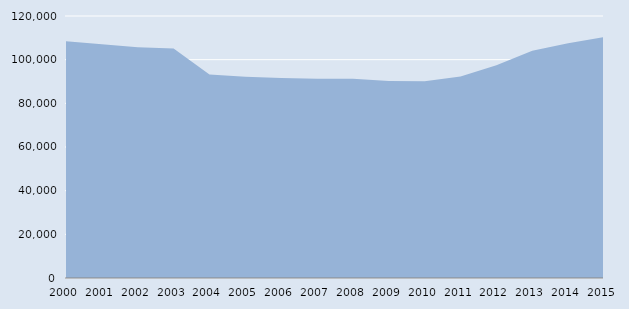
| Category | Series 0 |
|---|---|
| 2000.0 | 108397 |
| 2001.0 | 107057 |
| 2002.0 | 105667 |
| 2003.0 | 105135 |
| 2004.0 | 93190 |
| 2005.0 | 92136 |
| 2006.0 | 91651 |
| 2007.0 | 91253 |
| 2008.0 | 91225 |
| 2009.0 | 90203 |
| 2010.0 | 90148 |
| 2011.0 | 92343 |
| 2012.0 | 97445 |
| 2013.0 | 104084 |
| 2014.0 | 107470 |
| 2015.0 | 110384 |